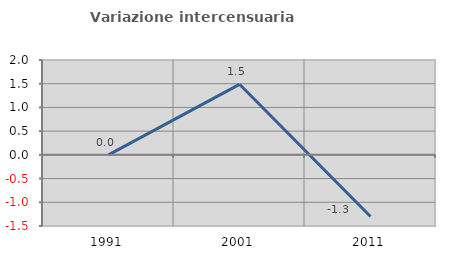
| Category | Variazione intercensuaria annua |
|---|---|
| 1991.0 | 0 |
| 2001.0 | 1.487 |
| 2011.0 | -1.299 |